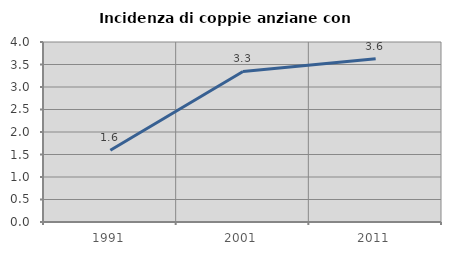
| Category | Incidenza di coppie anziane con figli |
|---|---|
| 1991.0 | 1.593 |
| 2001.0 | 3.346 |
| 2011.0 | 3.63 |